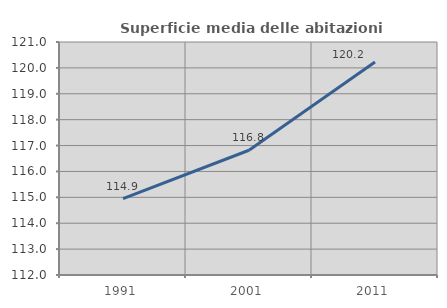
| Category | Superficie media delle abitazioni occupate |
|---|---|
| 1991.0 | 114.948 |
| 2001.0 | 116.818 |
| 2011.0 | 120.224 |